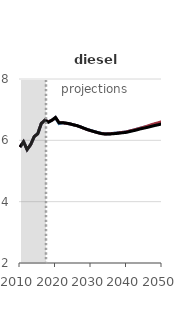
| Category | Autonomous battery electric vehicle | Autonomous hybrid electric vehicle  | Reference |
|---|---|---|---|
| 2010.0 | 5.779 | 5.779 | 5.779 |
| 2011.0 | 5.954 | 5.954 | 5.954 |
| 2012.0 | 5.699 | 5.699 | 5.699 |
| 2013.0 | 5.86 | 5.86 | 5.86 |
| 2014.0 | 6.122 | 6.122 | 6.122 |
| 2015.0 | 6.215 | 6.215 | 6.215 |
| 2016.0 | 6.548 | 6.548 | 6.548 |
| 2017.0 | 6.657 | 6.657 | 6.658 |
| 2018.0 | 6.609 | 6.61 | 6.589 |
| 2019.0 | 6.653 | 6.654 | 6.657 |
| 2020.0 | 6.741 | 6.741 | 6.744 |
| 2021.0 | 6.547 | 6.569 | 6.575 |
| 2022.0 | 6.574 | 6.574 | 6.575 |
| 2023.0 | 6.552 | 6.555 | 6.562 |
| 2024.0 | 6.537 | 6.537 | 6.54 |
| 2025.0 | 6.508 | 6.509 | 6.507 |
| 2026.0 | 6.481 | 6.478 | 6.481 |
| 2027.0 | 6.44 | 6.439 | 6.44 |
| 2028.0 | 6.394 | 6.391 | 6.395 |
| 2029.0 | 6.351 | 6.349 | 6.35 |
| 2030.0 | 6.317 | 6.313 | 6.314 |
| 2031.0 | 6.284 | 6.281 | 6.28 |
| 2032.0 | 6.252 | 6.248 | 6.248 |
| 2033.0 | 6.225 | 6.222 | 6.219 |
| 2034.0 | 6.213 | 6.21 | 6.205 |
| 2035.0 | 6.215 | 6.211 | 6.204 |
| 2036.0 | 6.225 | 6.221 | 6.214 |
| 2037.0 | 6.235 | 6.232 | 6.222 |
| 2038.0 | 6.25 | 6.247 | 6.236 |
| 2039.0 | 6.261 | 6.262 | 6.248 |
| 2040.0 | 6.276 | 6.278 | 6.262 |
| 2041.0 | 6.305 | 6.309 | 6.29 |
| 2042.0 | 6.334 | 6.336 | 6.316 |
| 2043.0 | 6.366 | 6.367 | 6.344 |
| 2044.0 | 6.399 | 6.4 | 6.376 |
| 2045.0 | 6.429 | 6.432 | 6.401 |
| 2046.0 | 6.457 | 6.468 | 6.426 |
| 2047.0 | 6.494 | 6.509 | 6.457 |
| 2048.0 | 6.526 | 6.544 | 6.484 |
| 2049.0 | 6.555 | 6.574 | 6.509 |
| 2050.0 | 6.592 | 6.611 | 6.539 |